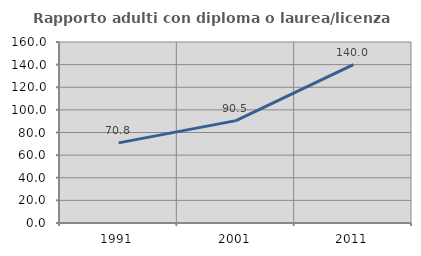
| Category | Rapporto adulti con diploma o laurea/licenza media  |
|---|---|
| 1991.0 | 70.833 |
| 2001.0 | 90.476 |
| 2011.0 | 140 |